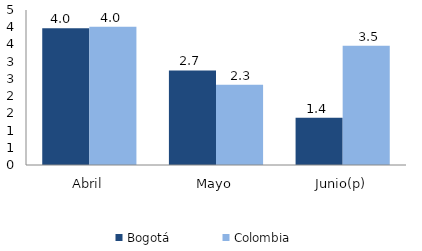
| Category | Bogotá | Colombia |
|---|---|---|
| Abril | 3.972 | 4.011 |
| Mayo | 2.745 | 2.333 |
| Junio(p) | 1.371 | 3.465 |